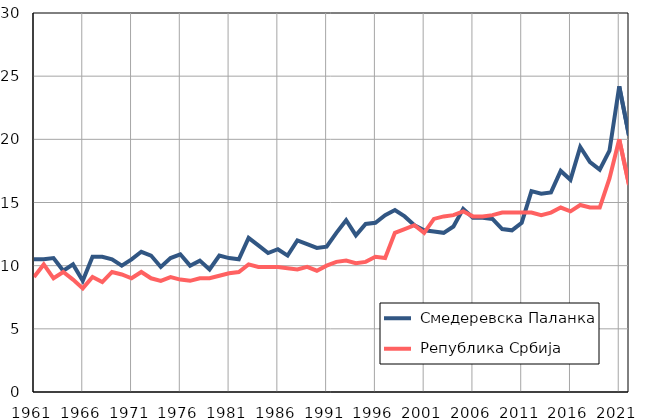
| Category |  Смедеревска Паланка |  Република Србија |
|---|---|---|
| 1961.0 | 10.5 | 9.1 |
| 1962.0 | 10.5 | 10.1 |
| 1963.0 | 10.6 | 9 |
| 1964.0 | 9.6 | 9.5 |
| 1965.0 | 10.1 | 8.9 |
| 1966.0 | 8.8 | 8.2 |
| 1967.0 | 10.7 | 9.1 |
| 1968.0 | 10.7 | 8.7 |
| 1969.0 | 10.5 | 9.5 |
| 1970.0 | 10 | 9.3 |
| 1971.0 | 10.5 | 9 |
| 1972.0 | 11.1 | 9.5 |
| 1973.0 | 10.8 | 9 |
| 1974.0 | 9.9 | 8.8 |
| 1975.0 | 10.6 | 9.1 |
| 1976.0 | 10.9 | 8.9 |
| 1977.0 | 10 | 8.8 |
| 1978.0 | 10.4 | 9 |
| 1979.0 | 9.7 | 9 |
| 1980.0 | 10.8 | 9.2 |
| 1981.0 | 10.6 | 9.4 |
| 1982.0 | 10.5 | 9.5 |
| 1983.0 | 12.2 | 10.1 |
| 1984.0 | 11.6 | 9.9 |
| 1985.0 | 11 | 9.9 |
| 1986.0 | 11.3 | 9.9 |
| 1987.0 | 10.8 | 9.8 |
| 1988.0 | 12 | 9.7 |
| 1989.0 | 11.7 | 9.9 |
| 1990.0 | 11.4 | 9.6 |
| 1991.0 | 11.5 | 10 |
| 1992.0 | 12.6 | 10.3 |
| 1993.0 | 13.6 | 10.4 |
| 1994.0 | 12.4 | 10.2 |
| 1995.0 | 13.3 | 10.3 |
| 1996.0 | 13.4 | 10.7 |
| 1997.0 | 14 | 10.6 |
| 1998.0 | 14.4 | 12.6 |
| 1999.0 | 13.9 | 12.9 |
| 2000.0 | 13.2 | 13.2 |
| 2001.0 | 12.8 | 12.6 |
| 2002.0 | 12.7 | 13.7 |
| 2003.0 | 12.6 | 13.9 |
| 2004.0 | 13.1 | 14 |
| 2005.0 | 14.5 | 14.3 |
| 2006.0 | 13.8 | 13.9 |
| 2007.0 | 13.8 | 13.9 |
| 2008.0 | 13.7 | 14 |
| 2009.0 | 12.9 | 14.2 |
| 2010.0 | 12.8 | 14.2 |
| 2011.0 | 13.4 | 14.2 |
| 2012.0 | 15.9 | 14.2 |
| 2013.0 | 15.7 | 14 |
| 2014.0 | 15.8 | 14.2 |
| 2015.0 | 17.5 | 14.6 |
| 2016.0 | 16.8 | 14.3 |
| 2017.0 | 19.4 | 14.8 |
| 2018.0 | 18.2 | 14.6 |
| 2019.0 | 17.6 | 14.6 |
| 2020.0 | 19.1 | 16.9 |
| 2021.0 | 24.2 | 20 |
| 2022.0 | 20.3 | 16.4 |